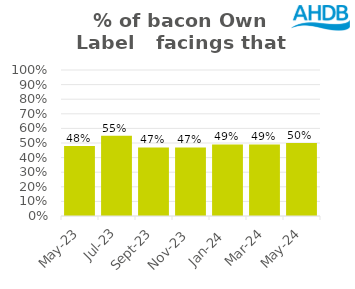
| Category | Bacon |
|---|---|
| 2023-05-01 | 0.48 |
| 2023-07-01 | 0.55 |
| 2023-09-01 | 0.47 |
| 2023-11-01 | 0.47 |
| 2024-01-01 | 0.49 |
| 2024-03-01 | 0.49 |
| 2024-05-01 | 0.5 |